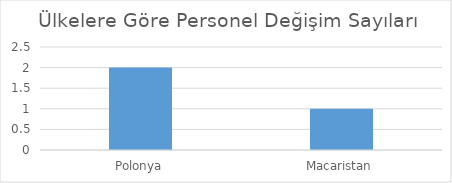
| Category | Toplam Sayı |
|---|---|
| Polonya | 2 |
| Macaristan | 1 |